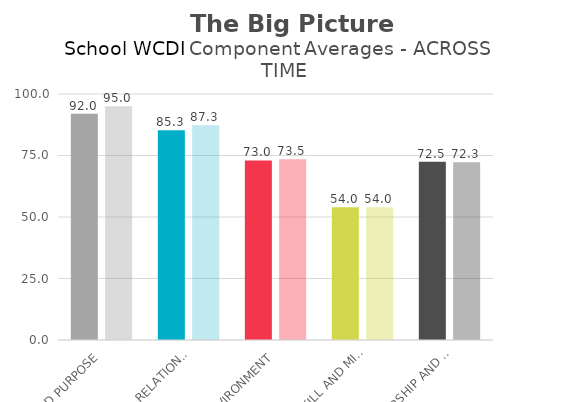
| Category | Time 1 | Time 2 |
|---|---|---|
| WHOLE-CHILD PURPOSE | 92 | 95 |
| DEVELOPMENTAL RELATIONSHIPS | 85.3 | 87.333 |
| SUPPORTIVE ENVIRONMENT | 73 | 73.5 |
| KNOWLEDGE, SKILL AND MINDSET BUILDING | 54 | 54 |
| SHARED LEADERSHIP AND OWNERSHIP | 72.5 | 72.3 |